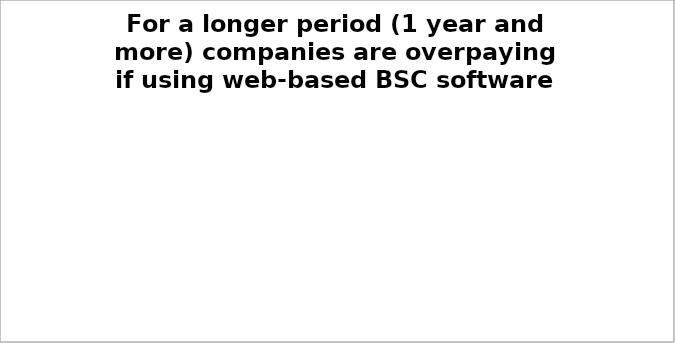
| Category | 1 Business Professional | 5 Business Units (5 power + 10 input users) |
|---|---|---|
| 1st Year | 332 | 1660 |
| 2nd Year | 931.2 | 4656 |
| 3rd Year | 931.2 | 4656 |
| 4th Year | 931.2 | 4656 |
| 5th Year | 931.2 | 4656 |